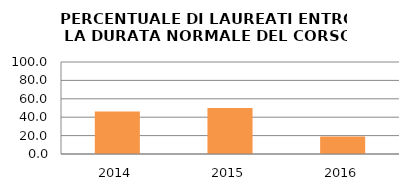
| Category | 2014 2015 2016 |
|---|---|
| 2014.0 | 46.154 |
| 2015.0 | 50 |
| 2016.0 | 19.048 |